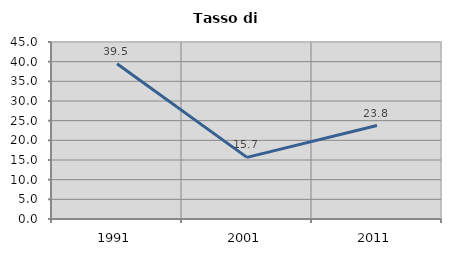
| Category | Tasso di disoccupazione   |
|---|---|
| 1991.0 | 39.478 |
| 2001.0 | 15.664 |
| 2011.0 | 23.768 |